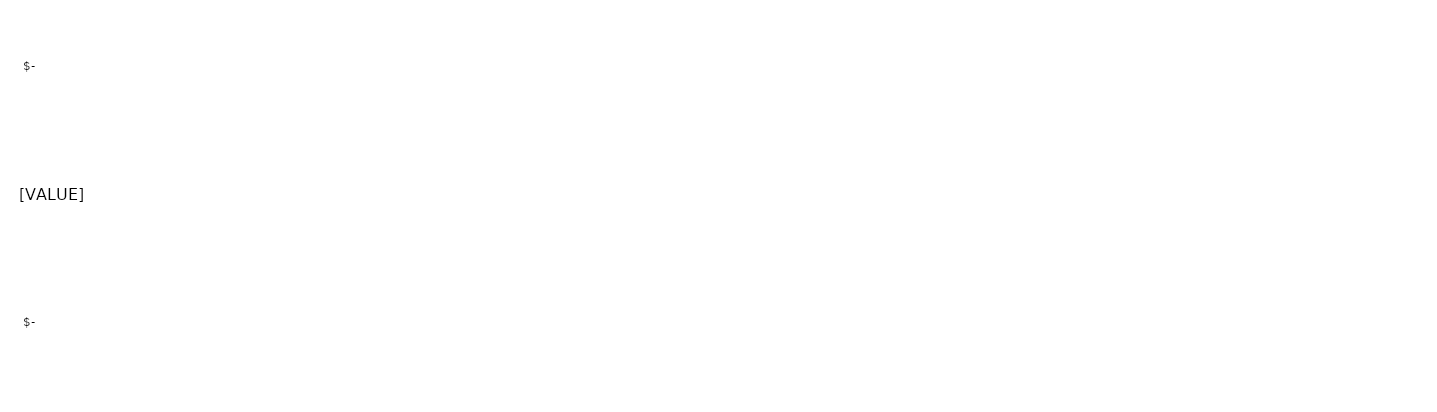
| Category | Series 0 |
|---|---|
|  ESTIMATED COST  | 0 |
|  ACTUAL COST  | 0 |
|  PAID  | 0 |